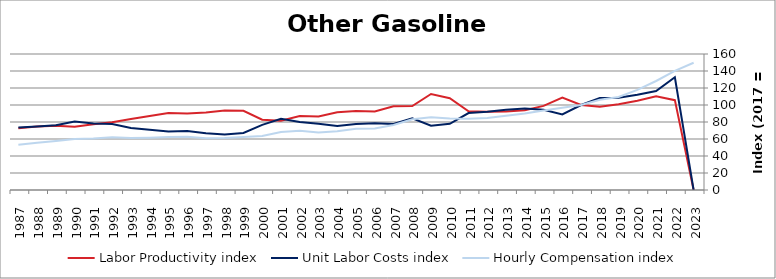
| Category | Labor Productivity index | Unit Labor Costs index | Hourly Compensation index |
|---|---|---|---|
| 2023.0 | 0 | 0 | 149.675 |
| 2022.0 | 105.695 | 132.68 | 140.236 |
| 2021.0 | 110.176 | 116.403 | 128.248 |
| 2020.0 | 105.058 | 112.184 | 117.858 |
| 2019.0 | 100.918 | 108.473 | 109.468 |
| 2018.0 | 98.022 | 108.215 | 106.075 |
| 2017.0 | 100 | 100 | 100 |
| 2016.0 | 108.855 | 88.96 | 96.837 |
| 2015.0 | 98.946 | 94.397 | 93.402 |
| 2014.0 | 93.909 | 95.827 | 89.99 |
| 2013.0 | 92.495 | 94.39 | 87.307 |
| 2012.0 | 92.034 | 92.161 | 84.819 |
| 2011.0 | 92.594 | 90.472 | 83.771 |
| 2010.0 | 107.949 | 77.886 | 84.077 |
| 2009.0 | 112.909 | 75.733 | 85.509 |
| 2008.0 | 98.693 | 84.287 | 83.185 |
| 2007.0 | 98.588 | 77.628 | 76.531 |
| 2006.0 | 92.355 | 78.432 | 72.437 |
| 2005.0 | 92.795 | 77.594 | 72.004 |
| 2004.0 | 91.543 | 75.391 | 69.015 |
| 2003.0 | 86.612 | 78.048 | 67.599 |
| 2002.0 | 86.943 | 80.029 | 69.58 |
| 2001.0 | 81.604 | 83.76 | 68.351 |
| 2000.0 | 82.723 | 76.671 | 63.424 |
| 1999.0 | 93.133 | 67.061 | 62.456 |
| 1998.0 | 93.453 | 65.383 | 61.103 |
| 1997.0 | 91.311 | 66.655 | 60.863 |
| 1996.0 | 90.084 | 69.382 | 62.502 |
| 1995.0 | 90.59 | 68.878 | 62.397 |
| 1994.0 | 87.033 | 70.768 | 61.591 |
| 1993.0 | 83.607 | 73.037 | 61.064 |
| 1992.0 | 79.728 | 77.707 | 61.954 |
| 1991.0 | 77.22 | 78.351 | 60.503 |
| 1990.0 | 74.522 | 80.59 | 60.057 |
| 1989.0 | 75.728 | 76.185 | 57.693 |
| 1988.0 | 74.614 | 74.634 | 55.688 |
| 1987.0 | 72.565 | 73.469 | 53.313 |